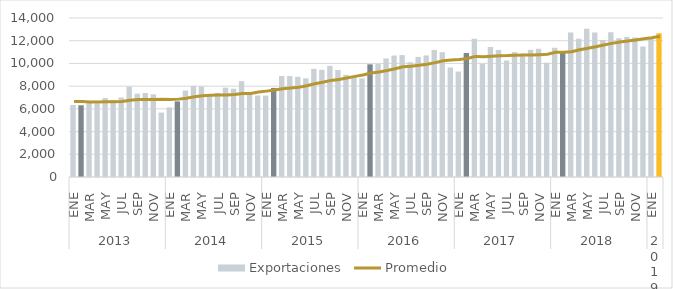
| Category | Exportaciones |
|---|---|
| 0 | 6343 |
| 1 | 6318 |
| 2 | 6647 |
| 3 | 6479 |
| 4 | 6949 |
| 5 | 6766 |
| 6 | 6997 |
| 7 | 7960 |
| 8 | 7340 |
| 9 | 7398 |
| 10 | 7281 |
| 11 | 5672 |
| 12 | 6130 |
| 13 | 6660 |
| 14 | 7617 |
| 15 | 8011 |
| 16 | 7966 |
| 17 | 7292 |
| 18 | 7404 |
| 19 | 7866 |
| 20 | 7767 |
| 21 | 8436 |
| 22 | 7381 |
| 23 | 7176 |
| 24 | 7170 |
| 25 | 7843 |
| 26 | 8899 |
| 27 | 8889 |
| 28 | 8822 |
| 29 | 8691 |
| 30 | 9526 |
| 31 | 9440 |
| 32 | 9790 |
| 33 | 9425 |
| 34 | 9000 |
| 35 | 8816 |
| 36 | 8680 |
| 37 | 9921 |
| 38 | 9962 |
| 39 | 10438 |
| 40 | 10693 |
| 41 | 10732 |
| 42 | 10104 |
| 43 | 10575 |
| 44 | 10702 |
| 45 | 11189 |
| 46 | 10990 |
| 47 | 9641 |
| 48 | 9282 |
| 49 | 10916 |
| 50 | 12170 |
| 51 | 9958 |
| 52 | 11443 |
| 53 | 11190 |
| 54 | 10250 |
| 55 | 10998 |
| 56 | 10862 |
| 57 | 11198 |
| 58 | 11291 |
| 59 | 10062 |
| 60 | 11384 |
| 61 | 10934 |
| 62 | 12720 |
| 63 | 12177 |
| 64 | 13045 |
| 65 | 12731 |
| 66 | 12055 |
| 67 | 12738 |
| 68 | 12214 |
| 69 | 12324 |
| 70 | 12282 |
| 71 | 11489 |
| 72 | 12328 |
| 73 | 12668 |